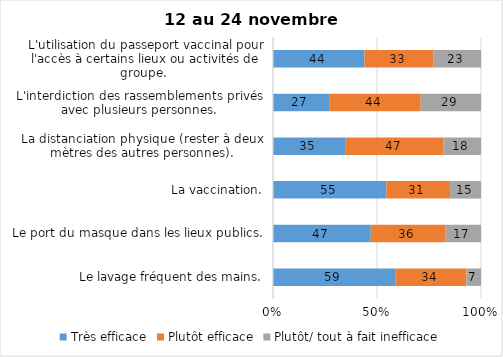
| Category | Très efficace | Plutôt efficace | Plutôt/ tout à fait inefficace |
|---|---|---|---|
| Le lavage fréquent des mains. | 59 | 34 | 7 |
| Le port du masque dans les lieux publics. | 47 | 36 | 17 |
| La vaccination. | 55 | 31 | 15 |
| La distanciation physique (rester à deux mètres des autres personnes). | 35 | 47 | 18 |
| L'interdiction des rassemblements privés avec plusieurs personnes. | 27 | 44 | 29 |
| L'utilisation du passeport vaccinal pour l'accès à certains lieux ou activités de groupe.  | 44 | 33 | 23 |